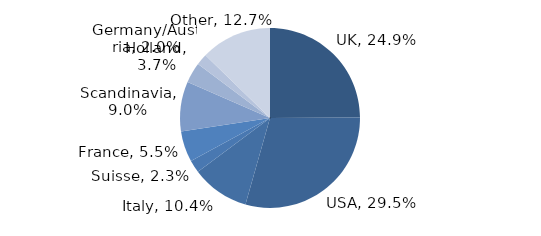
| Category | Investment Style |
|---|---|
| UK | 0.249 |
| USA | 0.295 |
| Italy | 0.104 |
| Suisse | 0.023 |
| France | 0.055 |
| Scandinavia | 0.09 |
| Holland | 0.037 |
| Germany/Austria | 0.02 |
| Other | 0.127 |